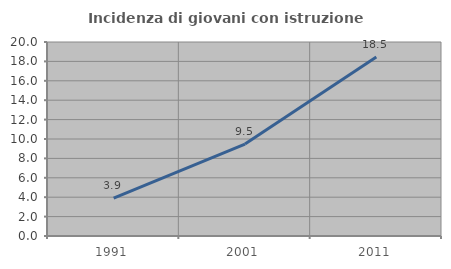
| Category | Incidenza di giovani con istruzione universitaria |
|---|---|
| 1991.0 | 3.896 |
| 2001.0 | 9.474 |
| 2011.0 | 18.462 |